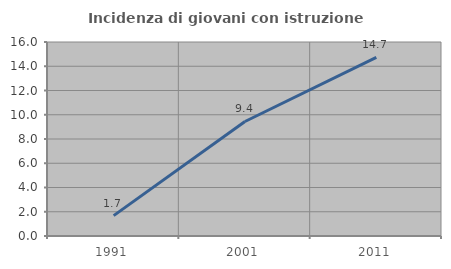
| Category | Incidenza di giovani con istruzione universitaria |
|---|---|
| 1991.0 | 1.681 |
| 2001.0 | 9.444 |
| 2011.0 | 14.729 |